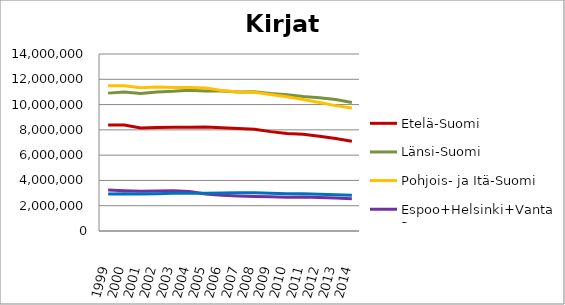
| Category | Etelä-Suomi | Länsi-Suomi | Pohjois- ja Itä-Suomi | Espoo+Helsinki+Vantaa | Muu Uusimaa |
|---|---|---|---|---|---|
| 1999.0 | 8382179 | 10905341 | 11493017 | 3233900 | 2925765 |
| 2000.0 | 8389056 | 10990656 | 11491666 | 3191425 | 2950242 |
| 2001.0 | 8149932 | 10875047 | 11338623 | 3151722 | 2920166 |
| 2002.0 | 8186839 | 10994403 | 11383364 | 3159704 | 2953203 |
| 2003.0 | 8214558 | 11047747 | 11357787 | 3181016 | 2977588 |
| 2004.0 | 8204244 | 11130757 | 11350046 | 3116253 | 2978086 |
| 2005.0 | 8226147 | 11069005 | 11318271 | 2931164 | 2981148 |
| 2006.0 | 8169474 | 11064796 | 11115074 | 2825318 | 3010365 |
| 2007.0 | 8106319 | 10993101 | 10993052 | 2775171 | 3033523 |
| 2008.0 | 8048553 | 11012205 | 10965469 | 2734887 | 3032122 |
| 2009.0 | 7859497 | 10877091 | 10803701 | 2707220 | 2979818 |
| 2010.0 | 7720838 | 10774239 | 10618625 | 2678720 | 2947599 |
| 2011.0 | 7647606 | 10629637 | 10399439 | 2694917 | 2941423 |
| 2012.0 | 7495880 | 10531547 | 10156575 | 2644781 | 2900039 |
| 2013.0 | 7308320 | 10398066 | 9917930 | 2616587 | 2876391 |
| 2014.0 | 7091317 | 10163276 | 9721459 | 2552166 | 2833188 |